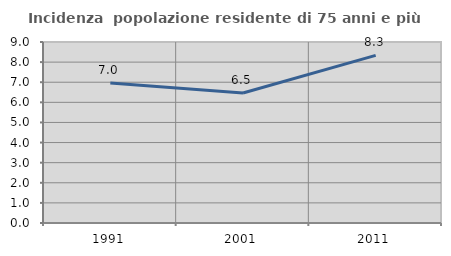
| Category | Incidenza  popolazione residente di 75 anni e più |
|---|---|
| 1991.0 | 6.963 |
| 2001.0 | 6.465 |
| 2011.0 | 8.336 |